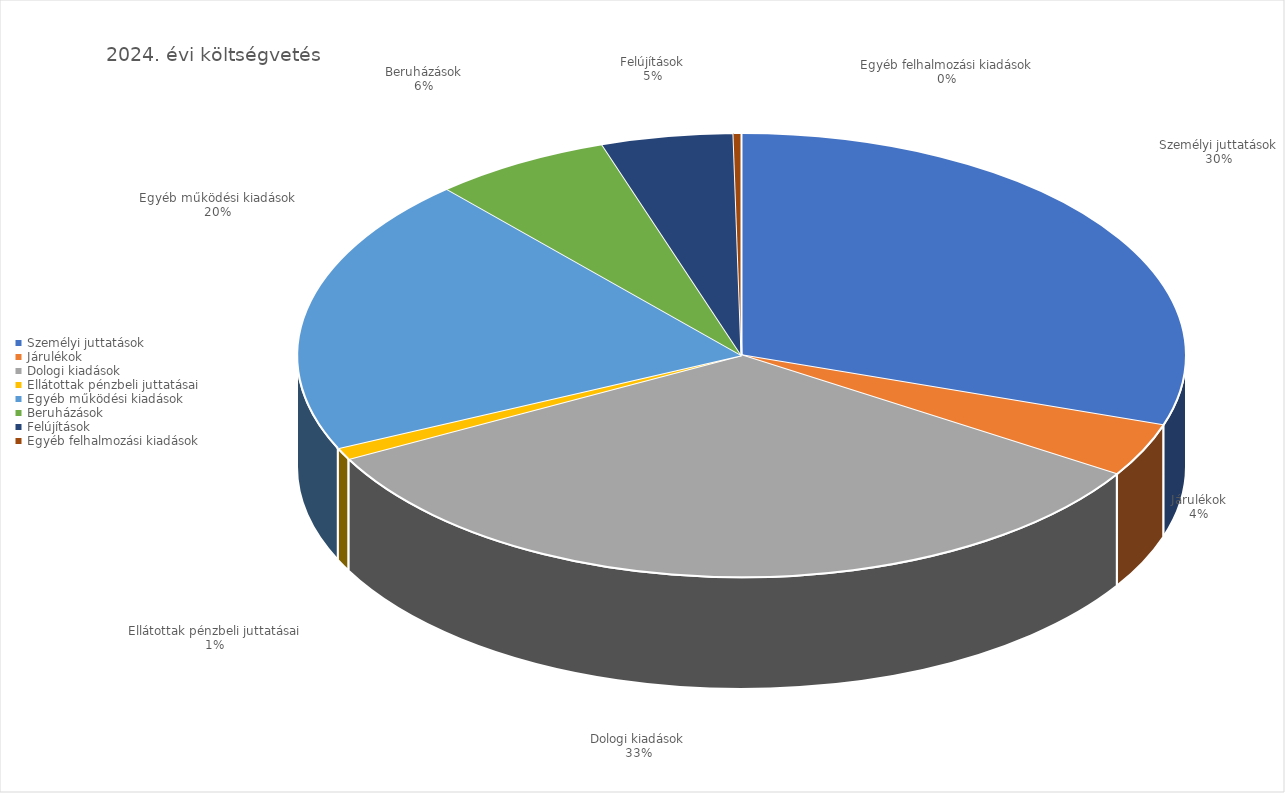
| Category | 2024 |
|---|---|
| Személyi juttatások | 15947314168 |
| Járulékok | 2056505950 |
| Dologi kiadások | 17607210157 |
| Ellátottak pénzbeli juttatásai | 458993244 |
| Egyéb működési kiadások | 10772050981 |
| Beruházások | 3417928883 |
| Felújítások | 2538961266 |
| Egyéb felhalmozási kiadások | 153490520 |